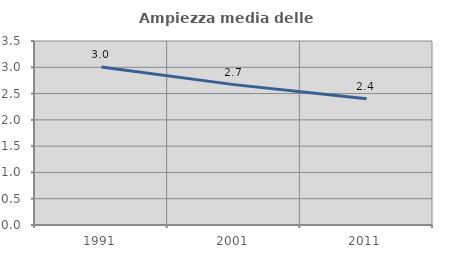
| Category | Ampiezza media delle famiglie |
|---|---|
| 1991.0 | 3.007 |
| 2001.0 | 2.67 |
| 2011.0 | 2.4 |